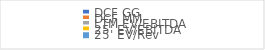
| Category | Weighting |
|---|---|
| DCF GG | 0.1 |
| DCF MM | 0.4 |
| LTM EV/EBITDA | 0.1 |
| 25' EV/EBITDA | 0.2 |
| 25' EV/Rev | 0.2 |